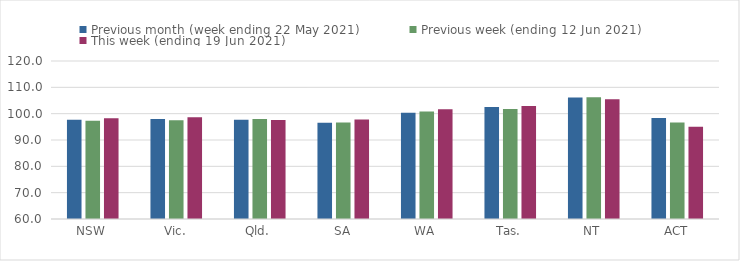
| Category | Previous month (week ending 22 May 2021) | Previous week (ending 12 Jun 2021) | This week (ending 19 Jun 2021) |
|---|---|---|---|
| NSW | 97.72 | 97.27 | 98.27 |
| Vic. | 97.97 | 97.47 | 98.64 |
| Qld. | 97.65 | 97.99 | 97.58 |
| SA | 96.54 | 96.69 | 97.81 |
| WA | 100.35 | 100.82 | 101.66 |
| Tas. | 102.55 | 101.79 | 102.89 |
| NT | 106.12 | 106.21 | 105.43 |
| ACT | 98.34 | 96.62 | 95.06 |